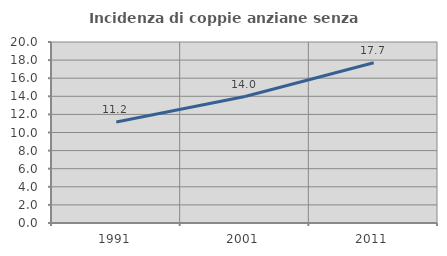
| Category | Incidenza di coppie anziane senza figli  |
|---|---|
| 1991.0 | 11.151 |
| 2001.0 | 13.972 |
| 2011.0 | 17.707 |